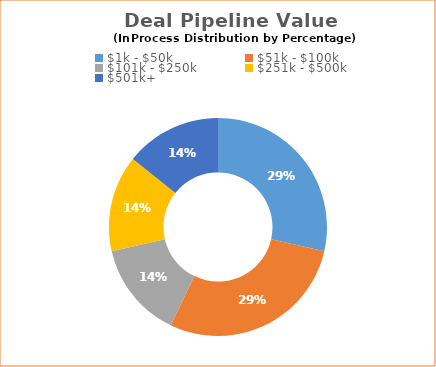
| Category | Series 0 |
|---|---|
| $1k - $50k | 0.286 |
| $51k - $100k | 0.286 |
| $101k - $250k | 0.143 |
| $251k - $500k | 0.143 |
| $501k+ | 0.143 |